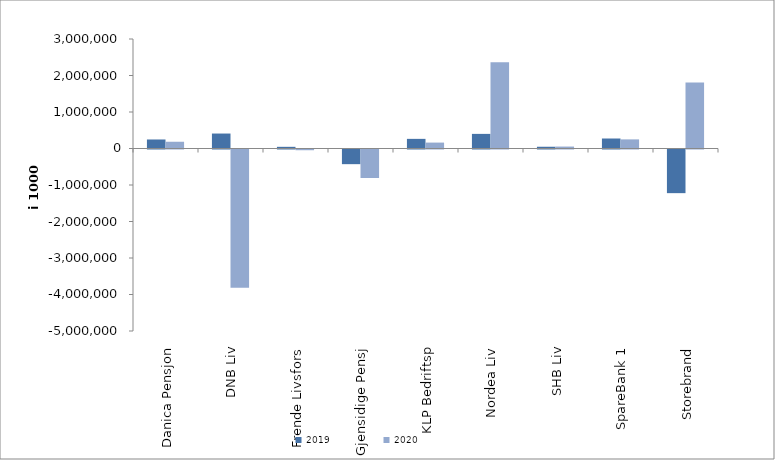
| Category | 2019 | 2020 |
|---|---|---|
| Danica Pensjon | 247084.222 | 184923.247 |
| DNB Liv | 410023 | -3785522 |
| Frende Livsfors | 45724 | -19904 |
| Gjensidige Pensj | -401668.1 | -781255.8 |
| KLP Bedriftsp | 263995 | 162061 |
| Nordea Liv | 400449.708 | 2363395.028 |
| SHB Liv | 47887.003 | 53104.75 |
| SpareBank 1 | 273876.597 | 249798.303 |
| Storebrand | -1195960.942 | 1810308.116 |